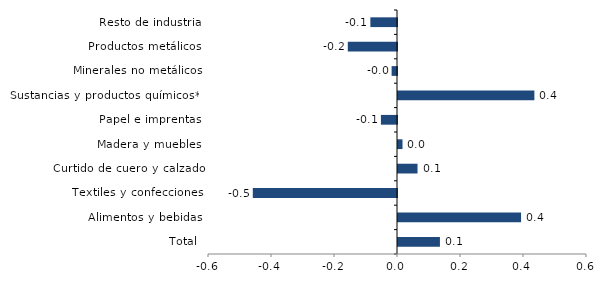
| Category | Series 0 |
|---|---|
| Total | 0.133 |
| Alimentos y bebidas | 0.391 |
| Textiles y confecciones | -0.458 |
| Curtido de cuero y calzado | 0.062 |
| Madera y muebles | 0.014 |
| Papel e imprentas | -0.051 |
| Sustancias y productos químicos** | 0.433 |
| Minerales no metálicos | -0.017 |
| Productos metálicos | -0.156 |
| Resto de industria | -0.085 |